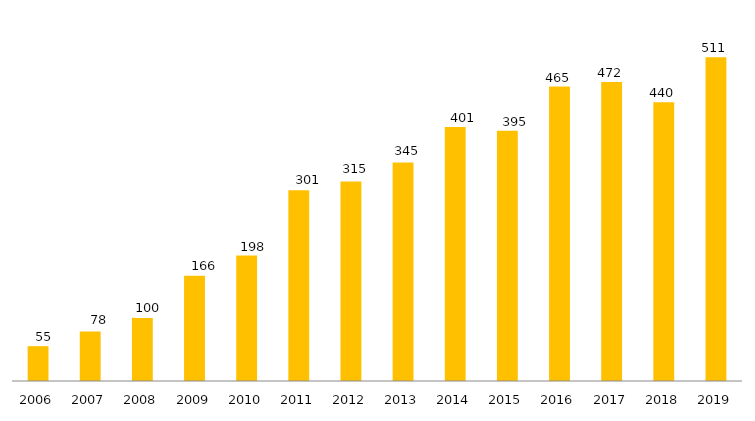
| Category | Programa |
|---|---|
| 2006.0 | 55 |
| 2007.0 | 78 |
| 2008.0 | 100 |
| 2009.0 | 166 |
| 2010.0 | 198 |
| 2011.0 | 301 |
| 2012.0 | 315 |
| 2013.0 | 345 |
| 2014.0 | 401 |
| 2015.0 | 395 |
| 2016.0 | 465 |
| 2017.0 | 472 |
| 2018.0 | 440 |
| 2019.0 | 511 |